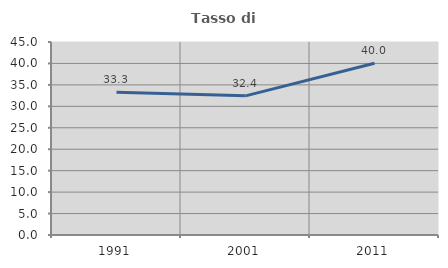
| Category | Tasso di occupazione   |
|---|---|
| 1991.0 | 33.293 |
| 2001.0 | 32.447 |
| 2011.0 | 40.028 |